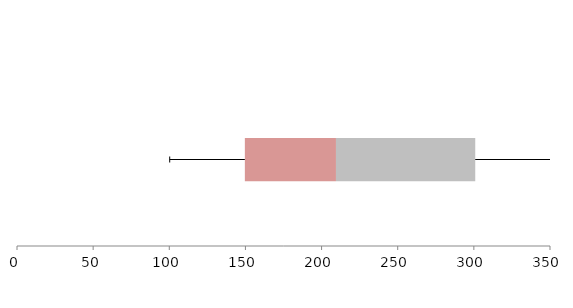
| Category | Series 1 | Series 2 | Series 3 |
|---|---|---|---|
| 0 | 149.624 | 59.826 | 91.464 |